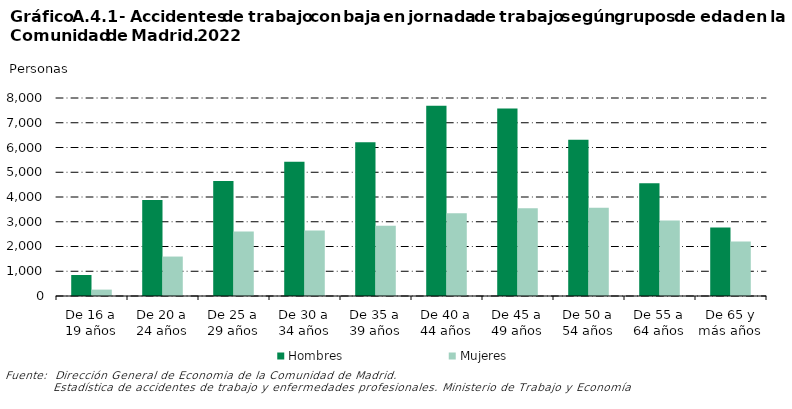
| Category | Hombres | Mujeres |
|---|---|---|
| 0 | 848 | 258 |
| 1 | 3879 | 1594 |
| 2 | 4646 | 2608 |
| 3 | 5420 | 2644 |
| 4 | 6209 | 2842 |
| 5 | 7689 | 3342 |
| 6 | 7572 | 3549 |
| 7 | 6312 | 3565 |
| 8 | 4552 | 3046 |
| 9 | 2772 | 2207 |